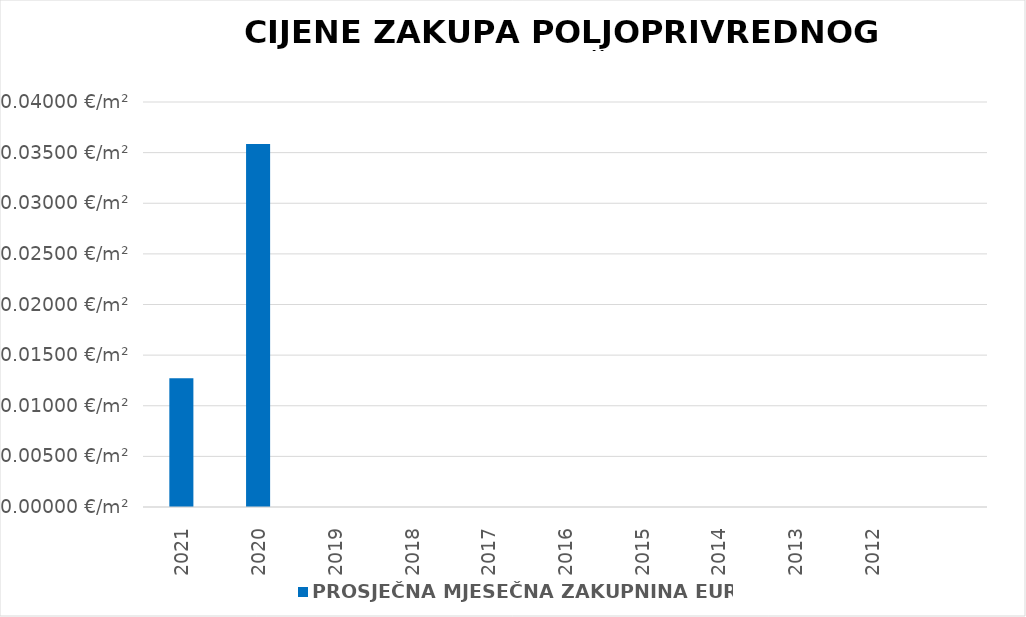
| Category | PROSJEČNA MJESEČNA ZAKUPNINA EUR/m2 |
|---|---|
| 2021 | 0.013 |
| 2020 | 0.036 |
| 2019 | 0 |
| 2018 | 0 |
| 2017 | 0 |
| 2016 | 0 |
| 2015 | 0 |
| 2014 | 0 |
| 2013 | 0 |
| 2012 | 0 |